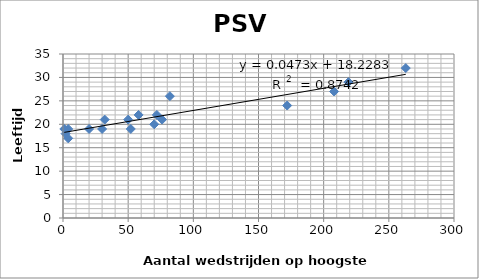
| Category | Wedstrijden |
|---|---|
| 1.0 | 19 |
| 2.0 | 18 |
| 4.0 | 19 |
| 4.0 | 17 |
| 20.0 | 19 |
| 30.0 | 19 |
| 32.0 | 21 |
| 50.0 | 21 |
| 52.0 | 19 |
| 58.0 | 22 |
| 70.0 | 20 |
| 72.0 | 22 |
| 76.0 | 21 |
| 82.0 | 26 |
| 172.0 | 24 |
| 208.0 | 27 |
| 219.0 | 29 |
| 263.0 | 32 |